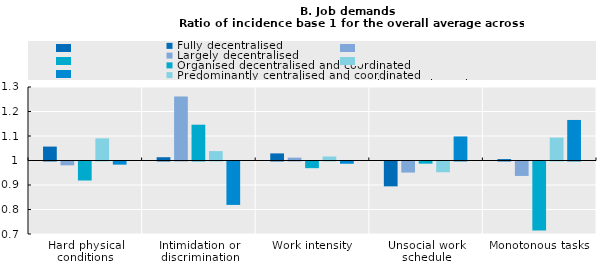
| Category | Fully decentralised | Largely decentralised | Organised decentralised and coordinated | Predominantly centralised and coordinated | Predominantly centralised and weakly co-ordinated |
|---|---|---|---|---|---|
| Hard physical conditions | 1.057 | 0.984 | 0.922 | 1.09 | 0.987 |
| Intimidation or discrimination | 1.013 | 1.261 | 1.146 | 1.038 | 0.823 |
| Work intensity | 1.029 | 1.012 | 0.973 | 1.016 | 0.991 |
| Unsocial work schedule | 0.899 | 0.955 | 0.991 | 0.956 | 1.098 |
| Monotonous tasks | 1.006 | 0.941 | 0.719 | 1.094 | 1.166 |